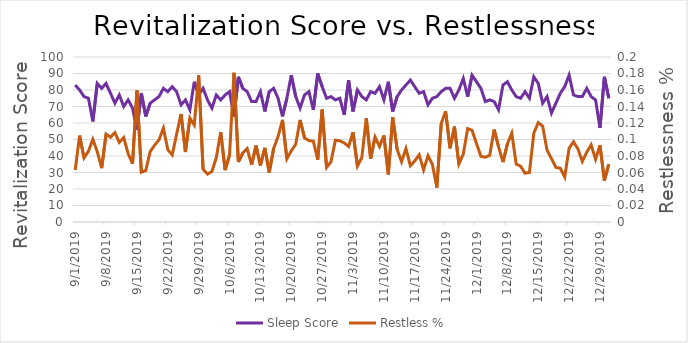
| Category | Deep Sleep |
|---|---|
| 9/1/19 | 77 |
| 9/2/19 | 119 |
| 9/3/19 | 22 |
| 9/4/19 | 59 |
| 9/5/19 | 55 |
| 9/6/19 | 95 |
| 9/7/19 | 80 |
| 9/8/19 | 120 |
| 9/9/19 | 65 |
| 9/10/19 | 74 |
| 9/11/19 | 50 |
| 9/12/19 | 67 |
| 9/13/19 | 78 |
| 9/14/19 | 64 |
| 9/15/19 | 75 |
| 9/16/19 | 76 |
| 9/17/19 | 0 |
| 9/18/19 | 79 |
| 9/19/19 | 43 |
| 9/20/19 | 71 |
| 9/21/19 | 125 |
| 9/22/19 | 107 |
| 9/23/19 | 70 |
| 9/24/19 | 68 |
| 9/25/19 | 58 |
| 9/26/19 | 54 |
| 9/27/19 | 69 |
| 9/28/19 | 97 |
| 9/29/19 | 106 |
| 9/30/19 | 83 |
| 10/1/19 | 25 |
| 10/2/19 | 62 |
| 10/3/19 | 68 |
| 10/4/19 | 103 |
| 10/5/19 | 48 |
| 10/6/19 | 94 |
| 10/7/19 | 71 |
| 10/8/19 | 95 |
| 10/9/19 | 118 |
| 10/10/19 | 68 |
| 10/11/19 | 41 |
| 10/12/19 | 90 |
| 10/13/19 | 26 |
| 10/14/19 | 47 |
| 10/15/19 | 94 |
| 10/16/19 | 84 |
| 10/17/19 | 59 |
| 10/18/19 | 81 |
| 10/19/19 | 79 |
| 10/20/19 | 75 |
| 10/21/19 | 67 |
| 10/22/19 | 61 |
| 10/23/19 | 52 |
| 10/24/19 | 85 |
| 10/25/19 | 85 |
| 10/26/19 | 118 |
| 10/27/19 | 110 |
| 10/28/19 | 51 |
| 10/29/19 | 69 |
| 10/30/19 | 59 |
| 10/31/19 | 63 |
| 11/1/19 | 64 |
| 11/2/19 | 94 |
| 11/3/19 | 95 |
| 11/4/19 | 67 |
| 11/5/19 | 84 |
| 11/6/19 | 68 |
| 11/7/19 | 101 |
| 11/8/19 | 68 |
| 11/9/19 | 116 |
| 11/10/19 | 99 |
| 11/11/19 | 85 |
| 11/12/19 | 59 |
| 11/13/19 | 44 |
| 11/14/19 | 76 |
| 11/15/19 | 92 |
| 11/16/19 | 93 |
| 11/17/19 | 75 |
| 11/18/19 | 56 |
| 11/19/19 | 86 |
| 11/20/19 | 51 |
| 11/21/19 | 65 |
| 11/22/19 | 45 |
| 11/23/19 | 84 |
| 11/24/19 | 147 |
| 11/25/19 | 87 |
| 11/26/19 | 51 |
| 11/27/19 | 40 |
| 11/28/19 | 138 |
| 11/29/19 | 103 |
| 11/30/19 | 91 |
| 12/1/19 | 77 |
| 12/2/19 | 63 |
| 12/3/19 | 48 |
| 12/4/19 | 42 |
| 12/5/19 | 66 |
| 12/6/19 | 98 |
| 12/7/19 | 95 |
| 12/8/19 | 109 |
| 12/9/19 | 62 |
| 12/10/19 | 69 |
| 12/11/19 | 67 |
| 12/12/19 | 94 |
| 12/13/19 | 52 |
| 12/14/19 | 83 |
| 12/15/19 | 82 |
| 12/16/19 | 58 |
| 12/17/19 | 73 |
| 12/18/19 | 32 |
| 12/19/19 | 56 |
| 12/20/19 | 73 |
| 12/21/19 | 50 |
| 12/22/19 | 104 |
| 12/23/19 | 69 |
| 12/24/19 | 84 |
| 12/25/19 | 83 |
| 12/26/19 | 86 |
| 12/27/19 | 105 |
| 12/28/19 | 91 |
| 12/29/19 | 57 |
| 12/30/19 | 87 |
| 12/31/19 | 33 |